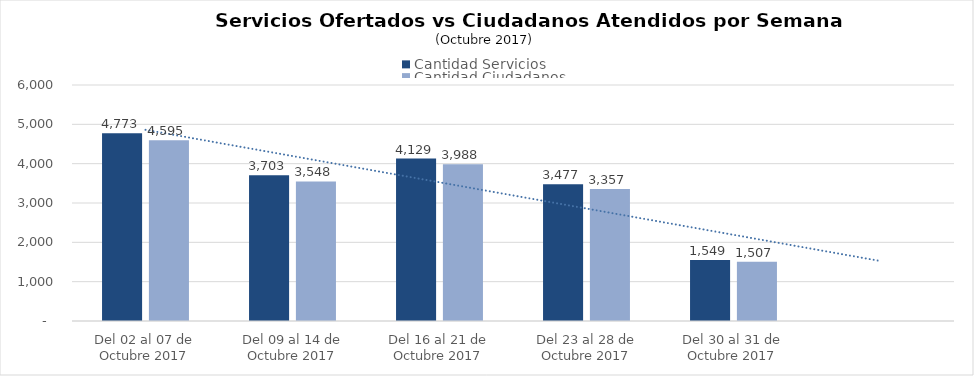
| Category | Cantidad Servicios | Cantidad Ciudadanos |
|---|---|---|
| Del 02 al 07 de Octubre 2017 | 4773 | 4595 |
| Del 09 al 14 de Octubre 2017 | 3703 | 3548 |
| Del 16 al 21 de Octubre 2017 | 4129 | 3988 |
| Del 23 al 28 de Octubre 2017 | 3477 | 3357 |
| Del 30 al 31 de Octubre 2017 | 1549 | 1507 |